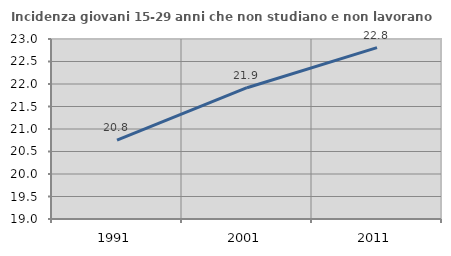
| Category | Incidenza giovani 15-29 anni che non studiano e non lavorano  |
|---|---|
| 1991.0 | 20.755 |
| 2001.0 | 21.918 |
| 2011.0 | 22.807 |